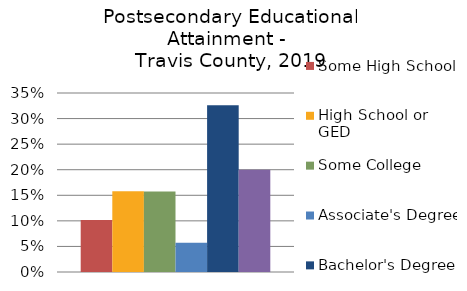
| Category | Some High School | High School or GED | Some College | Associate's Degree | Bachelor's Degree | Graduate or Professional Degree |
|---|---|---|---|---|---|---|
| Bachelor's Degree | 0.102 | 0.158 | 0.157 | 0.057 | 0.326 | 0.2 |